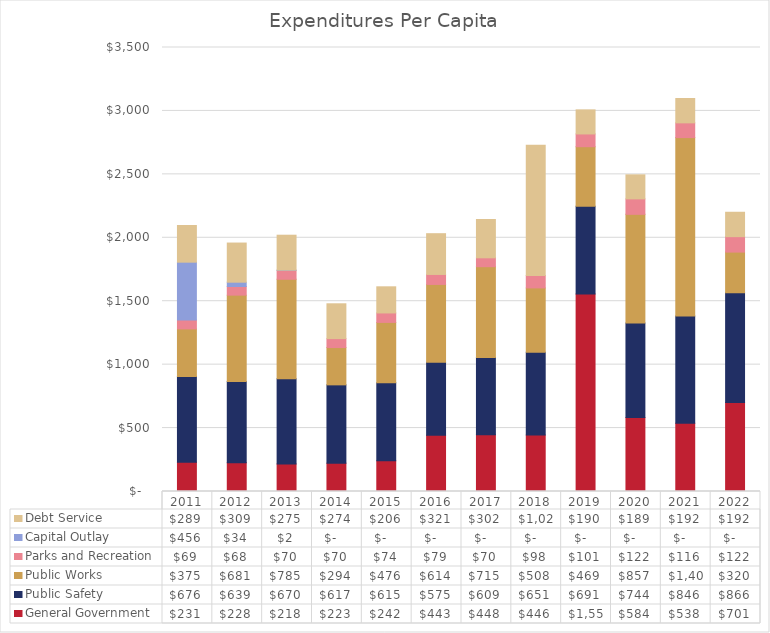
| Category | General Government | Public Safety | Public Works | Parks and Recreation | Capital Outlay | Debt Service |
|---|---|---|---|---|---|---|
| 2011.0 | 231.089 | 675.661 | 375.115 | 69.41 | 456.497 | 289.318 |
| 2012.0 | 227.562 | 639.066 | 681.27 | 68.118 | 33.913 | 308.616 |
| 2013.0 | 217.753 | 670.378 | 784.948 | 70.244 | 1.708 | 275.276 |
| 2014.0 | 223.456 | 617.183 | 294.126 | 70.444 | 0 | 274.48 |
| 2015.0 | 241.962 | 614.876 | 476.164 | 74.423 | 0 | 206.116 |
| 2016.0 | 443.138 | 575.21 | 613.948 | 78.646 | 0 | 321.347 |
| 2017.0 | 448.15 | 609.051 | 714.958 | 69.947 | 0 | 302.28 |
| 2018.0 | 446.156 | 650.631 | 508.153 | 97.842 | 0 | 1026.318 |
| 2019.0 | 1557.824 | 691.27 | 468.853 | 100.599 | 0 | 189.771 |
| 2020.0 | 583.727 | 744.362 | 856.763 | 121.945 | 0 | 189.382 |
| 2021.0 | 538.222 | 846.065 | 1405.556 | 116.157 | 0 | 191.841 |
| 2022.0 | 701.15 | 865.95 | 320.192 | 121.611 | 0 | 192.335 |